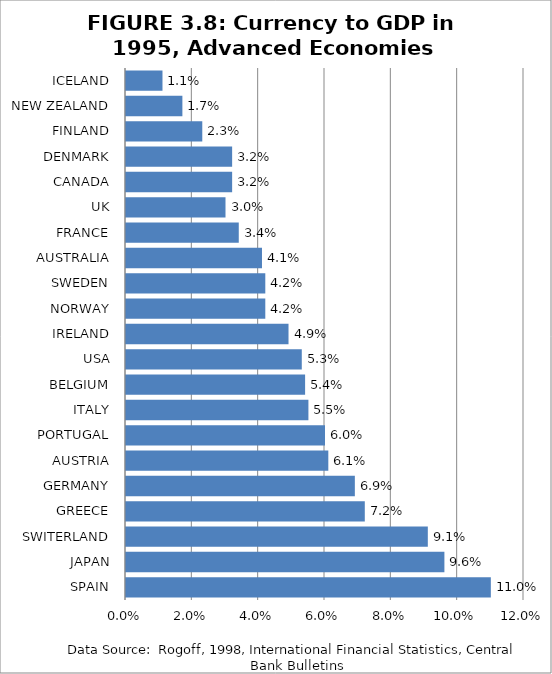
| Category | % Currency to GDP, 1995 |
|---|---|
| SPAIN | 0.11 |
| JAPAN | 0.096 |
| SWITERLAND | 0.091 |
| GREECE | 0.072 |
| GERMANY | 0.069 |
| AUSTRIA | 0.061 |
| PORTUGAL | 0.06 |
| ITALY | 0.055 |
| BELGIUM | 0.054 |
| USA | 0.053 |
| IRELAND | 0.049 |
| NORWAY | 0.042 |
| SWEDEN | 0.042 |
| AUSTRALIA | 0.041 |
| FRANCE | 0.034 |
| UK | 0.03 |
| CANADA | 0.032 |
| DENMARK | 0.032 |
| FINLAND | 0.023 |
| NEW ZEALAND | 0.017 |
| ICELAND | 0.011 |